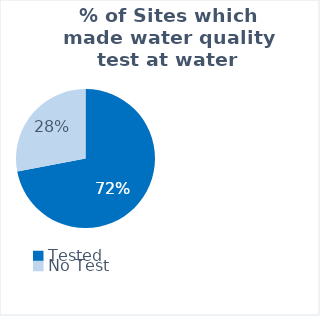
| Category | Central Rakhine |
|---|---|
| Tested | 18 |
| No Test | 7 |